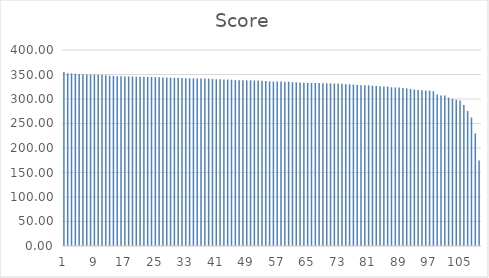
| Category | Column 3 |
|---|---|
| 0 | 355 |
| 1 | 352.4 |
| 2 | 352.1 |
| 3 | 351.3 |
| 4 | 350.8 |
| 5 | 350.6 |
| 6 | 350 |
| 7 | 349.6 |
| 8 | 349.6 |
| 9 | 349.3 |
| 10 | 349.1 |
| 11 | 348.5 |
| 12 | 347.5 |
| 13 | 347.1 |
| 14 | 346.5 |
| 15 | 346.2 |
| 16 | 346.1 |
| 17 | 346 |
| 18 | 345.9 |
| 19 | 345.6 |
| 20 | 345.5 |
| 21 | 345.2 |
| 22 | 345.1 |
| 23 | 345 |
| 24 | 344.7 |
| 25 | 344.4 |
| 26 | 343.8 |
| 27 | 343.8 |
| 28 | 343.5 |
| 29 | 343.4 |
| 30 | 343.2 |
| 31 | 342.8 |
| 32 | 342.5 |
| 33 | 342.2 |
| 34 | 342.2 |
| 35 | 342 |
| 36 | 341.7 |
| 37 | 341.7 |
| 38 | 341.7 |
| 39 | 341.1 |
| 40 | 340.3 |
| 41 | 340.1 |
| 42 | 339.8 |
| 43 | 339.7 |
| 44 | 339.6 |
| 45 | 338.5 |
| 46 | 338.3 |
| 47 | 338.2 |
| 48 | 338.1 |
| 49 | 338.1 |
| 50 | 337.9 |
| 51 | 337.7 |
| 52 | 337.3 |
| 53 | 336.9 |
| 54 | 336.1 |
| 55 | 335.6 |
| 56 | 335.6 |
| 57 | 335.5 |
| 58 | 335.4 |
| 59 | 335.3 |
| 60 | 334.3 |
| 61 | 333.9 |
| 62 | 333.5 |
| 63 | 333.2 |
| 64 | 332.9 |
| 65 | 332.7 |
| 66 | 332.6 |
| 67 | 332.5 |
| 68 | 332.3 |
| 69 | 332 |
| 70 | 331.8 |
| 71 | 331.7 |
| 72 | 331.5 |
| 73 | 331.1 |
| 74 | 330.3 |
| 75 | 329.9 |
| 76 | 329.6 |
| 77 | 328.6 |
| 78 | 328.3 |
| 79 | 328.1 |
| 80 | 327.8 |
| 81 | 327.1 |
| 82 | 326.5 |
| 83 | 326.2 |
| 84 | 325.4 |
| 85 | 325.3 |
| 86 | 323.9 |
| 87 | 323.4 |
| 88 | 323.3 |
| 89 | 322.6 |
| 90 | 321.7 |
| 91 | 320.6 |
| 92 | 319.2 |
| 93 | 318.2 |
| 94 | 318 |
| 95 | 317.2 |
| 96 | 317 |
| 97 | 316 |
| 98 | 309.4 |
| 99 | 307.1 |
| 100 | 306.9 |
| 101 | 303 |
| 102 | 300.5 |
| 103 | 298.6 |
| 104 | 297.1 |
| 105 | 287.7 |
| 106 | 275.7 |
| 107 | 262.2 |
| 108 | 229.9 |
| 109 | 174.5 |